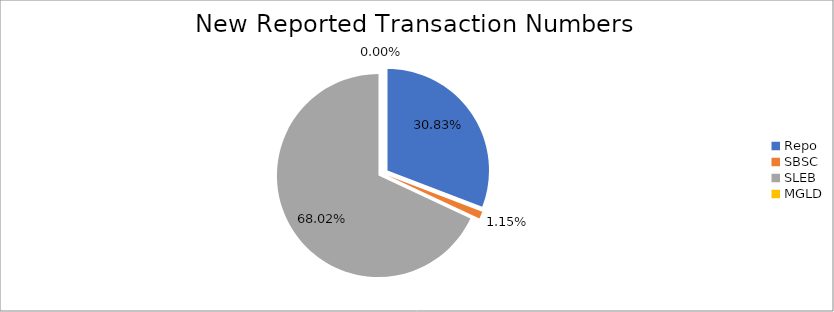
| Category | Series 0 |
|---|---|
| Repo | 304047 |
| SBSC | 11303 |
| SLEB | 670772 |
| MGLD | 15 |